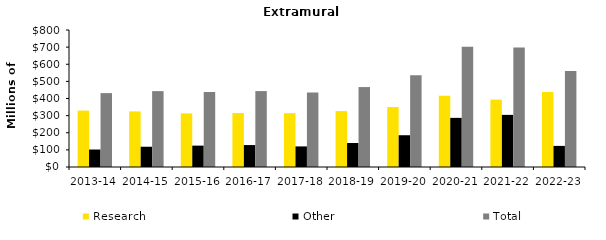
| Category | Research | Other | Total |
|---|---|---|---|
| 2013-14 | 329.382 | 102.06 | 431.442 |
| 2014-15 | 324.725 | 118.3 | 443.025 |
| 2015-16 | 313.097 | 124.838 | 437.935 |
| 2016-17 | 315.149 | 128.103 | 443.252 |
| 2017-18 | 314.276 | 120.246 | 434.523 |
| 2018-19 | 326.7 | 140.1 | 466.8 |
| 2019-20 | 349.9 | 185.5 | 535.4 |
| 2020-21 | 415.5 | 286.9 | 702.4 |
| 2021-22 | 393.476 | 304.413 | 697.889 |
| 2022-23 | 438.033 | 123.261 | 561.294 |